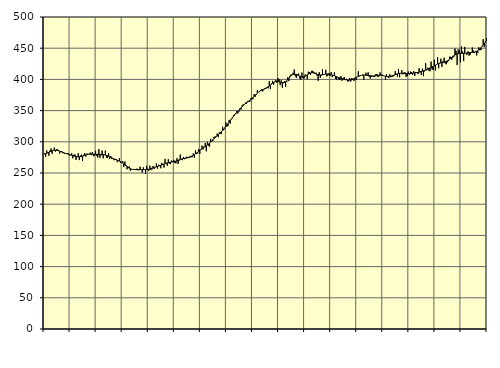
| Category | Piggar | Series 1 |
|---|---|---|
| nan | 281.5 | 280.25 |
| 87.0 | 275.9 | 280.93 |
| 87.0 | 286.2 | 281.68 |
| 87.0 | 282.8 | 282.46 |
| 87.0 | 277.7 | 283.2 |
| 87.0 | 285.9 | 283.98 |
| 87.0 | 289.3 | 284.76 |
| 87.0 | 280.8 | 285.46 |
| 87.0 | 285.9 | 286.04 |
| 87.0 | 290.7 | 286.43 |
| 87.0 | 284.3 | 286.58 |
| 87.0 | 287.8 | 286.46 |
| nan | 288 | 286.12 |
| 88.0 | 286.4 | 285.6 |
| 88.0 | 281.3 | 284.96 |
| 88.0 | 283.8 | 284.25 |
| 88.0 | 284.7 | 283.54 |
| 88.0 | 283.5 | 282.85 |
| 88.0 | 281.3 | 282.21 |
| 88.0 | 281 | 281.63 |
| 88.0 | 280.6 | 281.11 |
| 88.0 | 281.2 | 280.59 |
| 88.0 | 281.7 | 280.07 |
| 88.0 | 277.7 | 279.51 |
| nan | 279.2 | 278.94 |
| 89.0 | 281.5 | 278.37 |
| 89.0 | 273.6 | 277.79 |
| 89.0 | 279.1 | 277.26 |
| 89.0 | 279.8 | 276.76 |
| 89.0 | 270.9 | 276.34 |
| 89.0 | 275.8 | 276.04 |
| 89.0 | 281.5 | 275.89 |
| 89.0 | 270.7 | 275.91 |
| 89.0 | 277.9 | 276.09 |
| 89.0 | 279.5 | 276.44 |
| 89.0 | 269.6 | 276.95 |
| nan | 279 | 277.55 |
| 90.0 | 281.8 | 278.18 |
| 90.0 | 276.2 | 278.82 |
| 90.0 | 281.2 | 279.39 |
| 90.0 | 279.6 | 279.86 |
| 90.0 | 279.9 | 280.21 |
| 90.0 | 282.7 | 280.42 |
| 90.0 | 278.9 | 280.5 |
| 90.0 | 283.4 | 280.47 |
| 90.0 | 277 | 280.35 |
| 90.0 | 278 | 280.19 |
| 90.0 | 285.6 | 280.06 |
| nan | 277.6 | 279.98 |
| 91.0 | 274.9 | 279.92 |
| 91.0 | 288.2 | 279.88 |
| 91.0 | 274.4 | 279.86 |
| 91.0 | 278.4 | 279.82 |
| 91.0 | 286 | 279.72 |
| 91.0 | 273.6 | 279.53 |
| 91.0 | 279 | 279.22 |
| 91.0 | 286 | 278.79 |
| 91.0 | 275 | 278.25 |
| 91.0 | 273.7 | 277.59 |
| 91.0 | 282 | 276.81 |
| nan | 272.9 | 275.94 |
| 92.0 | 277.2 | 275.06 |
| 92.0 | 272.5 | 274.19 |
| 92.0 | 273.7 | 273.34 |
| 92.0 | 270.5 | 272.56 |
| 92.0 | 271.6 | 271.84 |
| 92.0 | 272.3 | 271.17 |
| 92.0 | 267.3 | 270.53 |
| 92.0 | 269.1 | 269.85 |
| 92.0 | 273.9 | 269.07 |
| 92.0 | 266.2 | 268.2 |
| 92.0 | 267.3 | 267.17 |
| nan | 269 | 265.95 |
| 93.0 | 259.6 | 264.59 |
| 93.0 | 268.3 | 263.13 |
| 93.0 | 263 | 261.66 |
| 93.0 | 255.9 | 260.23 |
| 93.0 | 258.3 | 258.92 |
| 93.0 | 260.6 | 257.78 |
| 93.0 | 253.5 | 256.89 |
| 93.0 | 255.8 | 256.26 |
| 93.0 | 256.4 | 255.84 |
| 93.0 | 256.2 | 255.63 |
| 93.0 | 255.9 | 255.56 |
| nan | 254.7 | 255.57 |
| 94.0 | 257 | 255.6 |
| 94.0 | 254.2 | 255.61 |
| 94.0 | 254.7 | 255.56 |
| 94.0 | 260.1 | 255.5 |
| 94.0 | 255.5 | 255.44 |
| 94.0 | 250.6 | 255.38 |
| 94.0 | 259.1 | 255.36 |
| 94.0 | 255.9 | 255.39 |
| 94.0 | 248.7 | 255.48 |
| 94.0 | 261.4 | 255.64 |
| 94.0 | 255.5 | 255.9 |
| nan | 253.2 | 256.27 |
| 95.0 | 261.8 | 256.73 |
| 95.0 | 254.6 | 257.24 |
| 95.0 | 255.7 | 257.82 |
| 95.0 | 261.3 | 258.37 |
| 95.0 | 256.3 | 258.89 |
| 95.0 | 259 | 259.43 |
| 95.0 | 265.3 | 259.97 |
| 95.0 | 257 | 260.51 |
| 95.0 | 263.3 | 261.1 |
| 95.0 | 261 | 261.72 |
| 95.0 | 257.6 | 262.34 |
| nan | 266.2 | 262.97 |
| 96.0 | 262.9 | 263.6 |
| 96.0 | 258.7 | 264.26 |
| 96.0 | 272.6 | 264.92 |
| 96.0 | 265 | 265.56 |
| 96.0 | 261.6 | 266.16 |
| 96.0 | 272 | 266.65 |
| 96.0 | 265 | 267.02 |
| 96.0 | 264.2 | 267.29 |
| 96.0 | 270 | 267.54 |
| 96.0 | 268.6 | 267.81 |
| 96.0 | 271.1 | 268.15 |
| nan | 265.9 | 268.58 |
| 97.0 | 265.6 | 269.09 |
| 97.0 | 273.7 | 269.7 |
| 97.0 | 264.6 | 270.36 |
| 97.0 | 269.8 | 271.01 |
| 97.0 | 279.6 | 271.68 |
| 97.0 | 271.5 | 272.3 |
| 97.0 | 270.6 | 272.85 |
| 97.0 | 275.7 | 273.32 |
| 97.0 | 272.1 | 273.69 |
| 97.0 | 273.2 | 273.98 |
| 97.0 | 276.1 | 274.26 |
| nan | 273.7 | 274.61 |
| 98.0 | 274.2 | 275.1 |
| 98.0 | 277.4 | 275.72 |
| 98.0 | 275.2 | 276.49 |
| 98.0 | 275.4 | 277.4 |
| 98.0 | 281.3 | 278.41 |
| 98.0 | 274.5 | 279.53 |
| 98.0 | 286.7 | 280.77 |
| 98.0 | 280.4 | 282.12 |
| 98.0 | 281.2 | 283.54 |
| 98.0 | 288.2 | 284.98 |
| 98.0 | 280.4 | 286.38 |
| nan | 288.5 | 287.72 |
| 99.0 | 293.9 | 288.98 |
| 99.0 | 287.9 | 290.16 |
| 99.0 | 292.6 | 291.3 |
| 99.0 | 298.2 | 292.44 |
| 99.0 | 284.7 | 293.65 |
| 99.0 | 299.9 | 294.95 |
| 99.0 | 294 | 296.39 |
| 99.0 | 292.3 | 297.97 |
| 99.0 | 304.8 | 299.66 |
| 99.0 | 301.1 | 301.43 |
| 99.0 | 301.2 | 303.24 |
| nan | 307.6 | 305.02 |
| 0.0 | 308.5 | 306.72 |
| 0.0 | 307.5 | 308.35 |
| 0.0 | 313 | 309.94 |
| 0.0 | 307.5 | 311.52 |
| 0.0 | 315 | 313.14 |
| 0.0 | 312.4 | 314.86 |
| 0.0 | 312.9 | 316.64 |
| 0.0 | 324.2 | 318.52 |
| 0.0 | 318.4 | 320.48 |
| 0.0 | 321.3 | 322.51 |
| 0.0 | 331.2 | 324.64 |
| nan | 324.3 | 326.86 |
| 1.0 | 325.5 | 329.14 |
| 1.0 | 335.1 | 331.47 |
| 1.0 | 329.2 | 333.82 |
| 1.0 | 335.5 | 336.13 |
| 1.0 | 339.5 | 338.41 |
| 1.0 | 343 | 340.62 |
| 1.0 | 343.5 | 342.78 |
| 1.0 | 346.1 | 344.86 |
| 1.0 | 349 | 346.87 |
| 1.0 | 345.3 | 348.83 |
| 1.0 | 348.4 | 350.75 |
| nan | 353.6 | 352.61 |
| 2.0 | 351.5 | 354.47 |
| 2.0 | 358.5 | 356.29 |
| 2.0 | 360.2 | 358.04 |
| 2.0 | 359.6 | 359.72 |
| 2.0 | 362.9 | 361.26 |
| 2.0 | 361.1 | 362.65 |
| 2.0 | 365.5 | 363.93 |
| 2.0 | 364.6 | 365.18 |
| 2.0 | 363.7 | 366.46 |
| 2.0 | 370 | 367.84 |
| 2.0 | 368.1 | 369.4 |
| nan | 368.3 | 371.1 |
| 3.0 | 376.3 | 372.88 |
| 3.0 | 372.1 | 374.69 |
| 3.0 | 375.2 | 376.44 |
| 3.0 | 382.7 | 378.04 |
| 3.0 | 379.6 | 379.46 |
| 3.0 | 379.7 | 380.71 |
| 3.0 | 382.9 | 381.77 |
| 3.0 | 384.3 | 382.69 |
| 3.0 | 380.8 | 383.53 |
| 3.0 | 383.8 | 384.34 |
| 3.0 | 386.3 | 385.19 |
| nan | 385.3 | 386.11 |
| 4.0 | 386.3 | 387.13 |
| 4.0 | 385.8 | 388.29 |
| 4.0 | 397.2 | 389.59 |
| 4.0 | 384.8 | 391.01 |
| 4.0 | 393.7 | 392.45 |
| 4.0 | 397.6 | 393.8 |
| 4.0 | 391.6 | 394.98 |
| 4.0 | 396.4 | 395.92 |
| 4.0 | 399 | 396.51 |
| 4.0 | 394.8 | 396.74 |
| 4.0 | 402 | 396.62 |
| nan | 400.1 | 396.2 |
| 5.0 | 390.8 | 395.62 |
| 5.0 | 398.5 | 395.04 |
| 5.0 | 386.7 | 394.6 |
| 5.0 | 395.9 | 394.51 |
| 5.0 | 396.9 | 394.99 |
| 5.0 | 387.8 | 396.05 |
| 5.0 | 395.7 | 397.63 |
| 5.0 | 403.5 | 399.61 |
| 5.0 | 397.3 | 401.81 |
| 5.0 | 405.6 | 403.94 |
| 5.0 | 407.8 | 405.79 |
| nan | 408.1 | 407.19 |
| 6.0 | 410.7 | 408.05 |
| 6.0 | 416 | 408.36 |
| 6.0 | 404.8 | 408.2 |
| 6.0 | 402.2 | 407.64 |
| 6.0 | 408 | 406.79 |
| 6.0 | 409.5 | 405.85 |
| 6.0 | 401.5 | 405.01 |
| 6.0 | 399.6 | 404.35 |
| 6.0 | 410.9 | 403.99 |
| 6.0 | 401.8 | 404 |
| 6.0 | 401.3 | 404.37 |
| nan | 408 | 405.08 |
| 7.0 | 405.4 | 406.08 |
| 7.0 | 400 | 407.23 |
| 7.0 | 412.4 | 408.4 |
| 7.0 | 411.7 | 409.48 |
| 7.0 | 407.2 | 410.27 |
| 7.0 | 413.7 | 410.66 |
| 7.0 | 413.8 | 410.65 |
| 7.0 | 412 | 410.28 |
| 7.0 | 410.3 | 409.63 |
| 7.0 | 410.8 | 408.83 |
| 7.0 | 406.2 | 408.07 |
| nan | 397.9 | 407.47 |
| 8.0 | 411.5 | 407.09 |
| 8.0 | 402.7 | 407.01 |
| 8.0 | 406.1 | 407.19 |
| 8.0 | 416.2 | 407.51 |
| 8.0 | 407.3 | 407.89 |
| 8.0 | 407.9 | 408.28 |
| 8.0 | 415.4 | 408.55 |
| 8.0 | 404.8 | 408.64 |
| 8.0 | 406.2 | 408.58 |
| 8.0 | 410.1 | 408.35 |
| 8.0 | 405.5 | 408 |
| nan | 411.8 | 407.58 |
| 9.0 | 403.5 | 407.07 |
| 9.0 | 406 | 406.46 |
| 9.0 | 411.9 | 405.79 |
| 9.0 | 401 | 405.07 |
| 9.0 | 399.7 | 404.33 |
| 9.0 | 403.1 | 403.62 |
| 9.0 | 400.1 | 402.94 |
| 9.0 | 399 | 402.28 |
| 9.0 | 405.4 | 401.69 |
| 9.0 | 397.9 | 401.17 |
| 9.0 | 402.1 | 400.71 |
| nan | 404 | 400.31 |
| 10.0 | 398.8 | 399.95 |
| 10.0 | 400.9 | 399.61 |
| 10.0 | 397 | 399.28 |
| 10.0 | 396.7 | 399.03 |
| 10.0 | 402.1 | 398.94 |
| 10.0 | 396.6 | 399.08 |
| 10.0 | 402.1 | 399.49 |
| 10.0 | 400.5 | 400.2 |
| 10.0 | 397.5 | 401.11 |
| 10.0 | 402.8 | 402.12 |
| 10.0 | 399.1 | 403.14 |
| nan | 404 | 404.08 |
| 11.0 | 412.9 | 404.91 |
| 11.0 | 404.9 | 405.61 |
| 11.0 | 407 | 406.18 |
| 11.0 | 406.6 | 406.6 |
| 11.0 | 407.7 | 406.87 |
| 11.0 | 399.6 | 406.97 |
| 11.0 | 406.9 | 406.92 |
| 11.0 | 410.7 | 406.75 |
| 11.0 | 405.6 | 406.55 |
| 11.0 | 411.2 | 406.33 |
| 11.0 | 404.5 | 406.11 |
| nan | 401.5 | 405.91 |
| 12.0 | 404.1 | 405.72 |
| 12.0 | 405 | 405.58 |
| 12.0 | 404.4 | 405.58 |
| 12.0 | 403.7 | 405.7 |
| 12.0 | 408.2 | 405.93 |
| 12.0 | 408.7 | 406.24 |
| 12.0 | 403.6 | 406.55 |
| 12.0 | 405.1 | 406.74 |
| 12.0 | 411.2 | 406.76 |
| 12.0 | 405.9 | 406.63 |
| 12.0 | 407.8 | 406.34 |
| nan | 406.7 | 405.94 |
| 13.0 | 405.4 | 405.47 |
| 13.0 | 399.3 | 405.05 |
| 13.0 | 408.4 | 404.72 |
| 13.0 | 404.3 | 404.54 |
| 13.0 | 402.1 | 404.55 |
| 13.0 | 408.4 | 404.74 |
| 13.0 | 403.6 | 405.11 |
| 13.0 | 404.4 | 405.64 |
| 13.0 | 404.6 | 406.27 |
| 13.0 | 406.1 | 406.95 |
| 13.0 | 413.3 | 407.68 |
| nan | 407.1 | 408.37 |
| 14.0 | 404.4 | 408.98 |
| 14.0 | 416.8 | 409.44 |
| 14.0 | 403.5 | 409.73 |
| 14.0 | 410 | 409.83 |
| 14.0 | 414.8 | 409.77 |
| 14.0 | 408 | 409.64 |
| 14.0 | 411 | 409.46 |
| 14.0 | 411.4 | 409.31 |
| 14.0 | 404.1 | 409.22 |
| 14.0 | 405.1 | 409.17 |
| 14.0 | 412.6 | 409.16 |
| nan | 407.6 | 409.23 |
| 15.0 | 412.6 | 409.39 |
| 15.0 | 411.7 | 409.65 |
| 15.0 | 407.2 | 409.98 |
| 15.0 | 413.3 | 410.31 |
| 15.0 | 405.6 | 410.56 |
| 15.0 | 411.8 | 410.73 |
| 15.0 | 411.7 | 410.92 |
| 15.0 | 408.4 | 411.17 |
| 15.0 | 417.9 | 411.51 |
| 15.0 | 413.1 | 411.96 |
| 15.0 | 407.1 | 412.54 |
| nan | 417.3 | 413.15 |
| 16.0 | 405.2 | 413.83 |
| 16.0 | 412.8 | 414.54 |
| 16.0 | 426 | 415.25 |
| 16.0 | 414.3 | 415.98 |
| 16.0 | 418.7 | 416.75 |
| 16.0 | 414.2 | 417.54 |
| 16.0 | 413.1 | 418.35 |
| 16.0 | 428.5 | 419.19 |
| 16.0 | 415.7 | 420.03 |
| 16.0 | 415.5 | 420.86 |
| 16.0 | 431.5 | 421.77 |
| nan | 414.2 | 422.78 |
| 17.0 | 423.4 | 423.81 |
| 17.0 | 435.6 | 424.79 |
| 17.0 | 417.9 | 425.58 |
| 17.0 | 425.5 | 426.17 |
| 17.0 | 433.2 | 426.65 |
| 17.0 | 420.1 | 427.06 |
| 17.0 | 429.4 | 427.41 |
| 17.0 | 434.8 | 427.73 |
| 17.0 | 425.6 | 428.19 |
| 17.0 | 424.2 | 428.89 |
| 17.0 | 427.5 | 429.8 |
| nan | 429.3 | 430.97 |
| 18.0 | 436.3 | 432.34 |
| 18.0 | 436.3 | 433.78 |
| 18.0 | 431.4 | 435.26 |
| 18.0 | 434.7 | 436.72 |
| 18.0 | 436.5 | 438.02 |
| 18.0 | 449.4 | 439.11 |
| 18.0 | 445.8 | 439.99 |
| 18.0 | 423.1 | 440.64 |
| 18.0 | 447.8 | 441.11 |
| 18.0 | 447.8 | 441.48 |
| 18.0 | 427.4 | 441.72 |
| nan | 453 | 441.82 |
| 19.0 | 444.7 | 441.84 |
| 19.0 | 429.4 | 441.82 |
| 19.0 | 452.1 | 441.88 |
| 19.0 | 442.1 | 442.07 |
| 19.0 | 439 | 442.3 |
| 19.0 | 445 | 442.52 |
| 19.0 | 438.1 | 442.72 |
| 19.0 | 439.6 | 442.94 |
| 19.0 | 443.8 | 443.14 |
| 19.0 | 451 | 443.29 |
| 19.0 | 446.2 | 443.47 |
| nan | 442.2 | 443.74 |
| 20.0 | 445.6 | 444.16 |
| 20.0 | 438.4 | 444.86 |
| 20.0 | 442.6 | 445.89 |
| 20.0 | 451.3 | 447.23 |
| 20.0 | 446.8 | 448.93 |
| 20.0 | 447 | 450.94 |
| 20.0 | 453.9 | 453.16 |
| 20.0 | 464.5 | 455.48 |
| 20.0 | 451.7 | 457.71 |
| 20.0 | 461.6 | 459.71 |
| 20.0 | 466.3 | 461.42 |